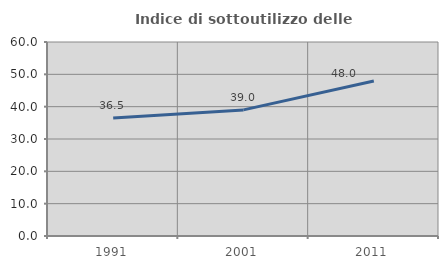
| Category | Indice di sottoutilizzo delle abitazioni  |
|---|---|
| 1991.0 | 36.472 |
| 2001.0 | 38.997 |
| 2011.0 | 47.965 |